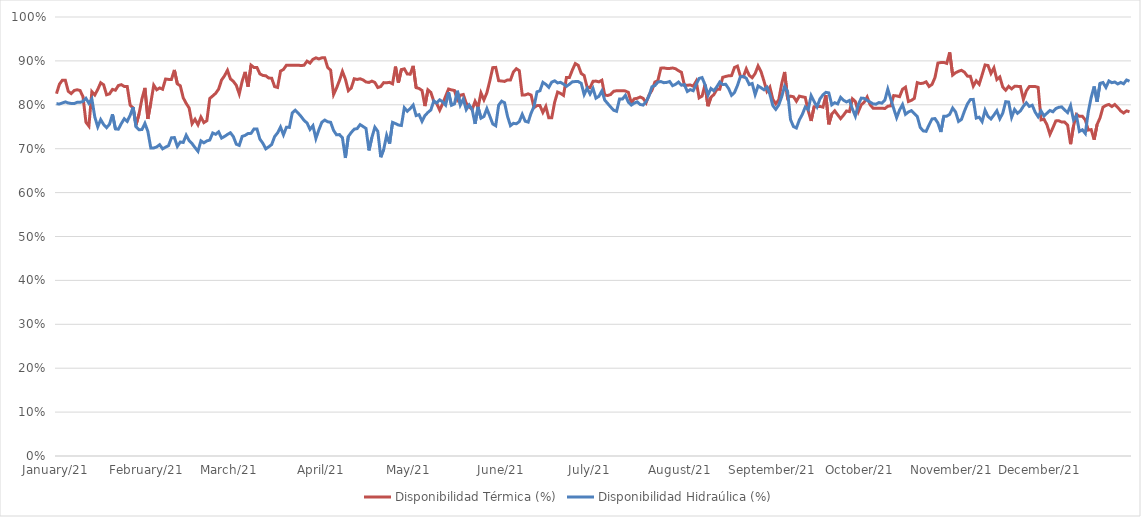
| Category | Disponibilidad Térmica (%) | Disponibilidad Hidraúlica (%) |
|---|---|---|
| 2021-01-01 | 0.825 | 0.802 |
| 2021-01-02 | 0.847 | 0.802 |
| 2021-01-03 | 0.856 | 0.804 |
| 2021-01-04 | 0.856 | 0.807 |
| 2021-01-05 | 0.831 | 0.804 |
| 2021-01-06 | 0.825 | 0.803 |
| 2021-01-07 | 0.833 | 0.803 |
| 2021-01-08 | 0.834 | 0.806 |
| 2021-01-09 | 0.833 | 0.806 |
| 2021-01-10 | 0.818 | 0.808 |
| 2021-01-11 | 0.76 | 0.815 |
| 2021-01-12 | 0.751 | 0.803 |
| 2021-01-13 | 0.83 | 0.814 |
| 2021-01-14 | 0.822 | 0.772 |
| 2021-01-15 | 0.835 | 0.75 |
| 2021-01-16 | 0.85 | 0.766 |
| 2021-01-17 | 0.846 | 0.755 |
| 2021-01-18 | 0.823 | 0.748 |
| 2021-01-19 | 0.825 | 0.756 |
| 2021-01-20 | 0.835 | 0.778 |
| 2021-01-21 | 0.833 | 0.745 |
| 2021-01-22 | 0.844 | 0.744 |
| 2021-01-23 | 0.846 | 0.757 |
| 2021-01-24 | 0.842 | 0.768 |
| 2021-01-25 | 0.842 | 0.762 |
| 2021-01-26 | 0.799 | 0.776 |
| 2021-01-27 | 0.793 | 0.794 |
| 2021-01-28 | 0.754 | 0.75 |
| 2021-01-29 | 0.779 | 0.743 |
| 2021-01-30 | 0.814 | 0.744 |
| 2021-01-31 | 0.838 | 0.758 |
| 2021-02-01 | 0.768 | 0.739 |
| 2021-02-02 | 0.805 | 0.702 |
| 2021-02-03 | 0.845 | 0.702 |
| 2021-02-04 | 0.834 | 0.704 |
| 2021-02-05 | 0.838 | 0.709 |
| 2021-02-06 | 0.835 | 0.7 |
| 2021-02-07 | 0.859 | 0.703 |
| 2021-02-08 | 0.858 | 0.707 |
| 2021-02-09 | 0.858 | 0.725 |
| 2021-02-10 | 0.879 | 0.725 |
| 2021-02-11 | 0.848 | 0.705 |
| 2021-02-12 | 0.843 | 0.715 |
| 2021-02-13 | 0.816 | 0.714 |
| 2021-02-14 | 0.803 | 0.731 |
| 2021-02-15 | 0.793 | 0.718 |
| 2021-02-16 | 0.757 | 0.712 |
| 2021-02-17 | 0.767 | 0.702 |
| 2021-02-18 | 0.754 | 0.694 |
| 2021-02-19 | 0.772 | 0.718 |
| 2021-02-20 | 0.759 | 0.713 |
| 2021-02-21 | 0.764 | 0.718 |
| 2021-02-22 | 0.814 | 0.72 |
| 2021-02-23 | 0.82 | 0.736 |
| 2021-02-24 | 0.826 | 0.733 |
| 2021-02-25 | 0.836 | 0.738 |
| 2021-02-26 | 0.856 | 0.724 |
| 2021-02-27 | 0.866 | 0.728 |
| 2021-02-28 | 0.879 | 0.732 |
| 2021-03-01 | 0.859 | 0.736 |
| 2021-03-02 | 0.853 | 0.728 |
| 2021-03-03 | 0.844 | 0.71 |
| 2021-03-04 | 0.825 | 0.707 |
| 2021-03-05 | 0.854 | 0.728 |
| 2021-03-06 | 0.875 | 0.73 |
| 2021-03-07 | 0.841 | 0.735 |
| 2021-03-08 | 0.89 | 0.735 |
| 2021-03-09 | 0.885 | 0.745 |
| 2021-03-10 | 0.885 | 0.745 |
| 2021-03-11 | 0.87 | 0.722 |
| 2021-03-12 | 0.867 | 0.713 |
| 2021-03-13 | 0.866 | 0.7 |
| 2021-03-14 | 0.861 | 0.704 |
| 2021-03-15 | 0.861 | 0.71 |
| 2021-03-16 | 0.841 | 0.728 |
| 2021-03-17 | 0.839 | 0.736 |
| 2021-03-18 | 0.877 | 0.749 |
| 2021-03-19 | 0.88 | 0.732 |
| 2021-03-20 | 0.89 | 0.749 |
| 2021-03-21 | 0.89 | 0.749 |
| 2021-03-22 | 0.89 | 0.782 |
| 2021-03-23 | 0.89 | 0.788 |
| 2021-03-24 | 0.89 | 0.781 |
| 2021-03-25 | 0.889 | 0.773 |
| 2021-03-26 | 0.89 | 0.764 |
| 2021-03-27 | 0.899 | 0.759 |
| 2021-03-28 | 0.895 | 0.744 |
| 2021-03-29 | 0.904 | 0.752 |
| 2021-03-30 | 0.907 | 0.723 |
| 2021-03-31 | 0.904 | 0.743 |
| 2021-04-01 | 0.907 | 0.76 |
| 2021-04-02 | 0.907 | 0.765 |
| 2021-04-03 | 0.885 | 0.761 |
| 2021-04-04 | 0.879 | 0.76 |
| 2021-04-05 | 0.823 | 0.742 |
| 2021-04-06 | 0.838 | 0.732 |
| 2021-04-07 | 0.855 | 0.732 |
| 2021-04-08 | 0.876 | 0.725 |
| 2021-04-09 | 0.859 | 0.679 |
| 2021-04-10 | 0.832 | 0.728 |
| 2021-04-11 | 0.838 | 0.737 |
| 2021-04-12 | 0.859 | 0.744 |
| 2021-04-13 | 0.858 | 0.746 |
| 2021-04-14 | 0.859 | 0.755 |
| 2021-04-15 | 0.857 | 0.751 |
| 2021-04-16 | 0.852 | 0.746 |
| 2021-04-17 | 0.851 | 0.696 |
| 2021-04-18 | 0.854 | 0.726 |
| 2021-04-19 | 0.851 | 0.749 |
| 2021-04-20 | 0.839 | 0.74 |
| 2021-04-21 | 0.842 | 0.681 |
| 2021-04-22 | 0.851 | 0.698 |
| 2021-04-23 | 0.85 | 0.731 |
| 2021-04-24 | 0.851 | 0.712 |
| 2021-04-25 | 0.848 | 0.76 |
| 2021-04-26 | 0.887 | 0.757 |
| 2021-04-27 | 0.85 | 0.754 |
| 2021-04-28 | 0.88 | 0.753 |
| 2021-04-29 | 0.882 | 0.793 |
| 2021-04-30 | 0.87 | 0.785 |
| 2021-05-01 | 0.87 | 0.791 |
| 2021-05-02 | 0.889 | 0.799 |
| 2021-05-03 | 0.839 | 0.775 |
| 2021-05-04 | 0.837 | 0.778 |
| 2021-05-05 | 0.833 | 0.762 |
| 2021-05-06 | 0.797 | 0.776 |
| 2021-05-07 | 0.834 | 0.783 |
| 2021-05-08 | 0.828 | 0.788 |
| 2021-05-09 | 0.808 | 0.809 |
| 2021-05-10 | 0.803 | 0.804 |
| 2021-05-11 | 0.788 | 0.811 |
| 2021-05-12 | 0.803 | 0.807 |
| 2021-05-13 | 0.819 | 0.799 |
| 2021-05-14 | 0.836 | 0.829 |
| 2021-05-15 | 0.834 | 0.799 |
| 2021-05-16 | 0.833 | 0.802 |
| 2021-05-17 | 0.811 | 0.832 |
| 2021-05-18 | 0.822 | 0.8 |
| 2021-05-19 | 0.824 | 0.813 |
| 2021-05-20 | 0.804 | 0.789 |
| 2021-05-21 | 0.795 | 0.8 |
| 2021-05-22 | 0.789 | 0.79 |
| 2021-05-23 | 0.808 | 0.757 |
| 2021-05-24 | 0.794 | 0.795 |
| 2021-05-25 | 0.827 | 0.77 |
| 2021-05-26 | 0.811 | 0.773 |
| 2021-05-27 | 0.827 | 0.791 |
| 2021-05-28 | 0.855 | 0.774 |
| 2021-05-29 | 0.885 | 0.756 |
| 2021-05-30 | 0.885 | 0.752 |
| 2021-05-31 | 0.855 | 0.799 |
| 2021-06-01 | 0.854 | 0.808 |
| 2021-06-02 | 0.853 | 0.805 |
| 2021-06-03 | 0.857 | 0.774 |
| 2021-06-04 | 0.857 | 0.753 |
| 2021-06-05 | 0.875 | 0.758 |
| 2021-06-06 | 0.882 | 0.757 |
| 2021-06-07 | 0.878 | 0.762 |
| 2021-06-08 | 0.822 | 0.778 |
| 2021-06-09 | 0.823 | 0.763 |
| 2021-06-10 | 0.825 | 0.761 |
| 2021-06-11 | 0.822 | 0.781 |
| 2021-06-12 | 0.794 | 0.796 |
| 2021-06-13 | 0.798 | 0.83 |
| 2021-06-14 | 0.798 | 0.832 |
| 2021-06-15 | 0.783 | 0.851 |
| 2021-06-16 | 0.796 | 0.847 |
| 2021-06-17 | 0.77 | 0.84 |
| 2021-06-18 | 0.77 | 0.852 |
| 2021-06-19 | 0.806 | 0.855 |
| 2021-06-20 | 0.829 | 0.85 |
| 2021-06-21 | 0.826 | 0.851 |
| 2021-06-22 | 0.821 | 0.847 |
| 2021-06-23 | 0.862 | 0.842 |
| 2021-06-24 | 0.862 | 0.847 |
| 2021-06-25 | 0.879 | 0.852 |
| 2021-06-26 | 0.894 | 0.853 |
| 2021-06-27 | 0.89 | 0.853 |
| 2021-06-28 | 0.871 | 0.849 |
| 2021-06-29 | 0.867 | 0.823 |
| 2021-06-30 | 0.84 | 0.838 |
| 2021-07-01 | 0.839 | 0.825 |
| 2021-07-02 | 0.853 | 0.837 |
| 2021-07-03 | 0.854 | 0.815 |
| 2021-07-04 | 0.852 | 0.819 |
| 2021-07-05 | 0.856 | 0.832 |
| 2021-07-06 | 0.822 | 0.811 |
| 2021-07-07 | 0.821 | 0.803 |
| 2021-07-08 | 0.824 | 0.795 |
| 2021-07-09 | 0.831 | 0.788 |
| 2021-07-10 | 0.832 | 0.785 |
| 2021-07-11 | 0.832 | 0.813 |
| 2021-07-12 | 0.832 | 0.813 |
| 2021-07-13 | 0.831 | 0.822 |
| 2021-07-14 | 0.828 | 0.806 |
| 2021-07-15 | 0.804 | 0.799 |
| 2021-07-16 | 0.814 | 0.804 |
| 2021-07-17 | 0.815 | 0.807 |
| 2021-07-18 | 0.818 | 0.801 |
| 2021-07-19 | 0.815 | 0.799 |
| 2021-07-20 | 0.804 | 0.807 |
| 2021-07-21 | 0.822 | 0.82 |
| 2021-07-22 | 0.833 | 0.841 |
| 2021-07-23 | 0.852 | 0.844 |
| 2021-07-24 | 0.855 | 0.852 |
| 2021-07-25 | 0.883 | 0.853 |
| 2021-07-26 | 0.884 | 0.85 |
| 2021-07-27 | 0.883 | 0.851 |
| 2021-07-28 | 0.883 | 0.853 |
| 2021-07-29 | 0.884 | 0.844 |
| 2021-07-30 | 0.882 | 0.847 |
| 2021-07-31 | 0.878 | 0.852 |
| 2021-08-01 | 0.874 | 0.845 |
| 2021-08-02 | 0.845 | 0.846 |
| 2021-08-03 | 0.845 | 0.83 |
| 2021-08-04 | 0.845 | 0.835 |
| 2021-08-05 | 0.842 | 0.832 |
| 2021-08-06 | 0.854 | 0.847 |
| 2021-08-07 | 0.816 | 0.86 |
| 2021-08-08 | 0.82 | 0.862 |
| 2021-08-09 | 0.846 | 0.846 |
| 2021-08-10 | 0.797 | 0.822 |
| 2021-08-11 | 0.817 | 0.837 |
| 2021-08-12 | 0.823 | 0.832 |
| 2021-08-13 | 0.835 | 0.841 |
| 2021-08-14 | 0.835 | 0.852 |
| 2021-08-15 | 0.863 | 0.846 |
| 2021-08-16 | 0.865 | 0.847 |
| 2021-08-17 | 0.866 | 0.837 |
| 2021-08-18 | 0.866 | 0.822 |
| 2021-08-19 | 0.885 | 0.828 |
| 2021-08-20 | 0.888 | 0.844 |
| 2021-08-21 | 0.865 | 0.864 |
| 2021-08-22 | 0.864 | 0.865 |
| 2021-08-23 | 0.882 | 0.86 |
| 2021-08-24 | 0.867 | 0.846 |
| 2021-08-25 | 0.862 | 0.849 |
| 2021-08-26 | 0.871 | 0.823 |
| 2021-08-27 | 0.889 | 0.843 |
| 2021-08-28 | 0.875 | 0.839 |
| 2021-08-29 | 0.854 | 0.834 |
| 2021-08-30 | 0.831 | 0.84 |
| 2021-08-31 | 0.84 | 0.824 |
| 2021-09-01 | 0.813 | 0.798 |
| 2021-09-02 | 0.802 | 0.79 |
| 2021-09-03 | 0.811 | 0.799 |
| 2021-09-04 | 0.848 | 0.818 |
| 2021-09-05 | 0.875 | 0.842 |
| 2021-09-06 | 0.815 | 0.831 |
| 2021-09-07 | 0.82 | 0.766 |
| 2021-09-08 | 0.818 | 0.75 |
| 2021-09-09 | 0.808 | 0.747 |
| 2021-09-10 | 0.82 | 0.766 |
| 2021-09-11 | 0.818 | 0.778 |
| 2021-09-12 | 0.817 | 0.795 |
| 2021-09-13 | 0.787 | 0.789 |
| 2021-09-14 | 0.763 | 0.821 |
| 2021-09-15 | 0.795 | 0.808 |
| 2021-09-16 | 0.796 | 0.795 |
| 2021-09-17 | 0.796 | 0.814 |
| 2021-09-18 | 0.795 | 0.823 |
| 2021-09-19 | 0.822 | 0.828 |
| 2021-09-20 | 0.756 | 0.827 |
| 2021-09-21 | 0.779 | 0.8 |
| 2021-09-22 | 0.786 | 0.805 |
| 2021-09-23 | 0.777 | 0.802 |
| 2021-09-24 | 0.768 | 0.817 |
| 2021-09-25 | 0.777 | 0.81 |
| 2021-09-26 | 0.786 | 0.806 |
| 2021-09-27 | 0.785 | 0.81 |
| 2021-09-28 | 0.814 | 0.79 |
| 2021-09-29 | 0.807 | 0.774 |
| 2021-09-30 | 0.784 | 0.801 |
| 2021-10-01 | 0.8 | 0.815 |
| 2021-10-02 | 0.806 | 0.815 |
| 2021-10-03 | 0.818 | 0.81 |
| 2021-10-04 | 0.8 | 0.806 |
| 2021-10-05 | 0.792 | 0.802 |
| 2021-10-06 | 0.792 | 0.801 |
| 2021-10-07 | 0.792 | 0.805 |
| 2021-10-08 | 0.792 | 0.804 |
| 2021-10-09 | 0.791 | 0.81 |
| 2021-10-10 | 0.797 | 0.836 |
| 2021-10-11 | 0.798 | 0.813 |
| 2021-10-12 | 0.821 | 0.792 |
| 2021-10-13 | 0.82 | 0.771 |
| 2021-10-14 | 0.819 | 0.788 |
| 2021-10-15 | 0.835 | 0.801 |
| 2021-10-16 | 0.84 | 0.778 |
| 2021-10-17 | 0.807 | 0.784 |
| 2021-10-18 | 0.81 | 0.787 |
| 2021-10-19 | 0.815 | 0.78 |
| 2021-10-20 | 0.851 | 0.773 |
| 2021-10-21 | 0.848 | 0.749 |
| 2021-10-22 | 0.849 | 0.741 |
| 2021-10-23 | 0.852 | 0.74 |
| 2021-10-24 | 0.842 | 0.754 |
| 2021-10-25 | 0.846 | 0.768 |
| 2021-10-26 | 0.862 | 0.769 |
| 2021-10-27 | 0.895 | 0.759 |
| 2021-10-28 | 0.896 | 0.738 |
| 2021-10-29 | 0.897 | 0.774 |
| 2021-10-30 | 0.894 | 0.774 |
| 2021-10-31 | 0.919 | 0.778 |
| 2021-11-01 | 0.868 | 0.793 |
| 2021-11-02 | 0.873 | 0.784 |
| 2021-11-03 | 0.876 | 0.762 |
| 2021-11-04 | 0.879 | 0.767 |
| 2021-11-05 | 0.874 | 0.786 |
| 2021-11-06 | 0.865 | 0.802 |
| 2021-11-07 | 0.865 | 0.812 |
| 2021-11-08 | 0.843 | 0.812 |
| 2021-11-09 | 0.855 | 0.77 |
| 2021-11-10 | 0.847 | 0.772 |
| 2021-11-11 | 0.868 | 0.762 |
| 2021-11-12 | 0.891 | 0.788 |
| 2021-11-13 | 0.889 | 0.774 |
| 2021-11-14 | 0.871 | 0.768 |
| 2021-11-15 | 0.884 | 0.777 |
| 2021-11-16 | 0.858 | 0.786 |
| 2021-11-17 | 0.863 | 0.768 |
| 2021-11-18 | 0.84 | 0.781 |
| 2021-11-19 | 0.833 | 0.807 |
| 2021-11-20 | 0.842 | 0.806 |
| 2021-11-21 | 0.836 | 0.771 |
| 2021-11-22 | 0.842 | 0.789 |
| 2021-11-23 | 0.842 | 0.781 |
| 2021-11-24 | 0.842 | 0.786 |
| 2021-11-25 | 0.812 | 0.797 |
| 2021-11-26 | 0.832 | 0.805 |
| 2021-11-27 | 0.841 | 0.796 |
| 2021-11-28 | 0.842 | 0.799 |
| 2021-11-29 | 0.842 | 0.783 |
| 2021-11-30 | 0.84 | 0.773 |
| 2021-12-01 | 0.766 | 0.786 |
| 2021-12-02 | 0.767 | 0.774 |
| 2021-12-03 | 0.754 | 0.781 |
| 2021-12-04 | 0.733 | 0.787 |
| 2021-12-05 | 0.748 | 0.784 |
| 2021-12-06 | 0.763 | 0.791 |
| 2021-12-07 | 0.764 | 0.794 |
| 2021-12-08 | 0.761 | 0.795 |
| 2021-12-09 | 0.761 | 0.788 |
| 2021-12-10 | 0.754 | 0.782 |
| 2021-12-11 | 0.71 | 0.798 |
| 2021-12-12 | 0.752 | 0.766 |
| 2021-12-13 | 0.778 | 0.775 |
| 2021-12-14 | 0.774 | 0.739 |
| 2021-12-15 | 0.774 | 0.743 |
| 2021-12-16 | 0.766 | 0.735 |
| 2021-12-17 | 0.742 | 0.783 |
| 2021-12-18 | 0.743 | 0.817 |
| 2021-12-19 | 0.721 | 0.842 |
| 2021-12-20 | 0.755 | 0.807 |
| 2021-12-21 | 0.77 | 0.849 |
| 2021-12-22 | 0.795 | 0.851 |
| 2021-12-23 | 0.799 | 0.84 |
| 2021-12-24 | 0.801 | 0.854 |
| 2021-12-25 | 0.796 | 0.85 |
| 2021-12-26 | 0.801 | 0.852 |
| 2021-12-27 | 0.794 | 0.848 |
| 2021-12-28 | 0.786 | 0.851 |
| 2021-12-29 | 0.781 | 0.848 |
| 2021-12-30 | 0.786 | 0.857 |
| 2021-12-31 | 0.784 | 0.854 |